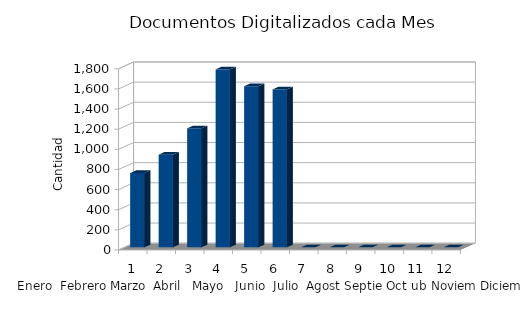
| Category | Series 0 |
|---|---|
| 0 | 738 |
| 1 | 921 |
| 2 | 1182 |
| 3 | 1768 |
| 4 | 1601 |
| 5 | 1569 |
| 6 | 0 |
| 7 | 0 |
| 8 | 0 |
| 9 | 0 |
| 10 | 0 |
| 11 | 0 |